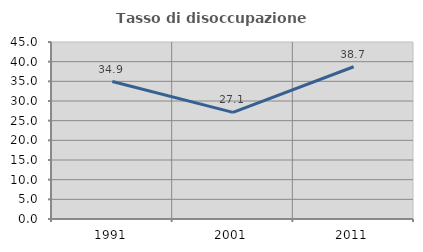
| Category | Tasso di disoccupazione giovanile  |
|---|---|
| 1991.0 | 34.94 |
| 2001.0 | 27.119 |
| 2011.0 | 38.71 |